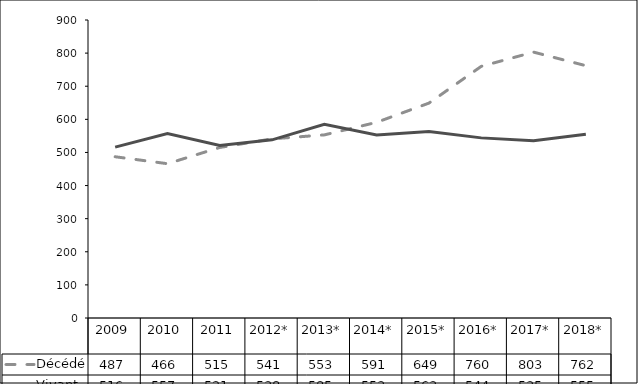
| Category | Décédé | Vivant |
|---|---|---|
| 2009 | 487 | 516 |
| 2010 | 466 | 557 |
| 2011 | 515 | 521 |
| 2012* | 541 | 538 |
| 2013* | 553 | 585 |
| 2014* | 591 | 553 |
| 2015* | 649 | 563 |
| 2016* | 760 | 544 |
| 2017* | 803 | 535 |
| 2018* | 762 | 555 |